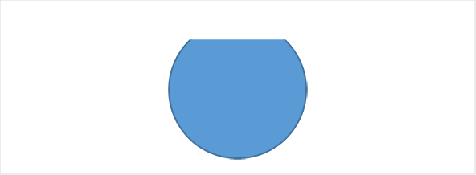
| Category | Series 1 | % completion |
|---|---|---|
| 0 |  | 0.5 |